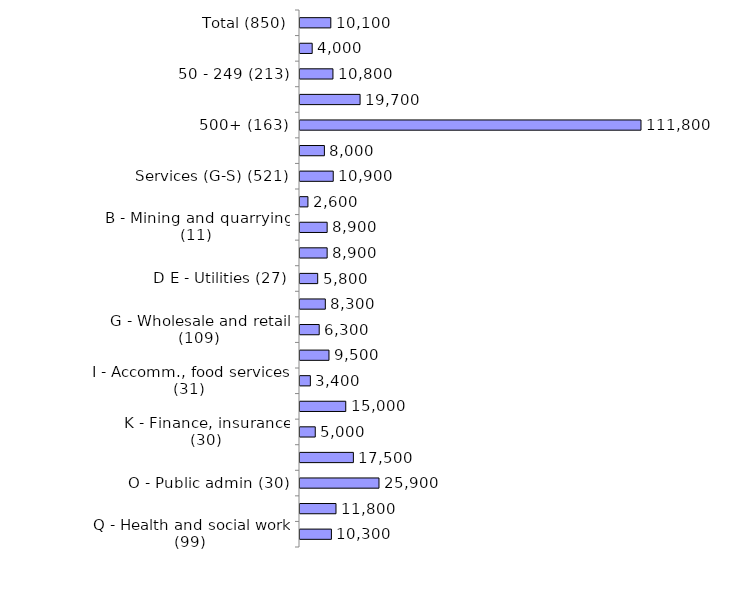
| Category | Series 0 |
|---|---|
| Total (850) | 10100 |
| 10-49 (376) | 4000 |
| 50 - 249 (213) | 10800 |
| 250 - 499 (98) | 19700 |
| 500+ (163) | 111800 |
| Production (A-F) (329) | 8000 |
| Services (G-S) (521) | 10900 |
| A - Agriculture (30) | 2600 |
| B - Mining and quarrying (11) | 8900 |
| C - Manufacturing (201) | 8900 |
| D E - Utilities (27) | 5800 |
| F - Construction (60) | 8300 |
| G - Wholesale and retail (109) | 6300 |
| H - Transport, storage (29) | 9500 |
| I - Accomm., food services (31) | 3400 |
| J - Information, comms (19) | 15000 |
| K - Finance, insurance (30) | 5000 |
| LMNRS - Bus/tech/admin/arts/other (68) | 17500 |
| O - Public admin (30) | 25900 |
| P - Education (106) | 11800 |
| Q - Health and social work (99) | 10300 |